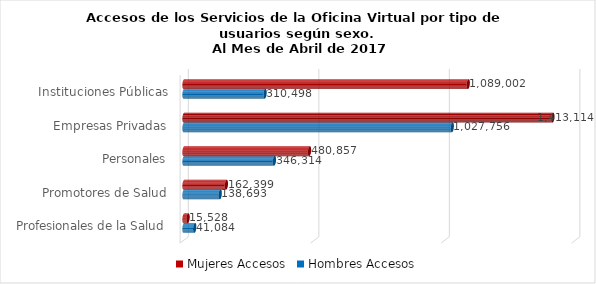
| Category | Mujeres | Hombres |
|---|---|---|
| Instituciones Públicas | 1089002 | 310498 |
| Empresas Privadas | 1413114 | 1027756 |
| Personales | 480857 | 346314 |
| Promotores de Salud | 162399 | 138693 |
| Profesionales de la Salud | 15528 | 41084 |